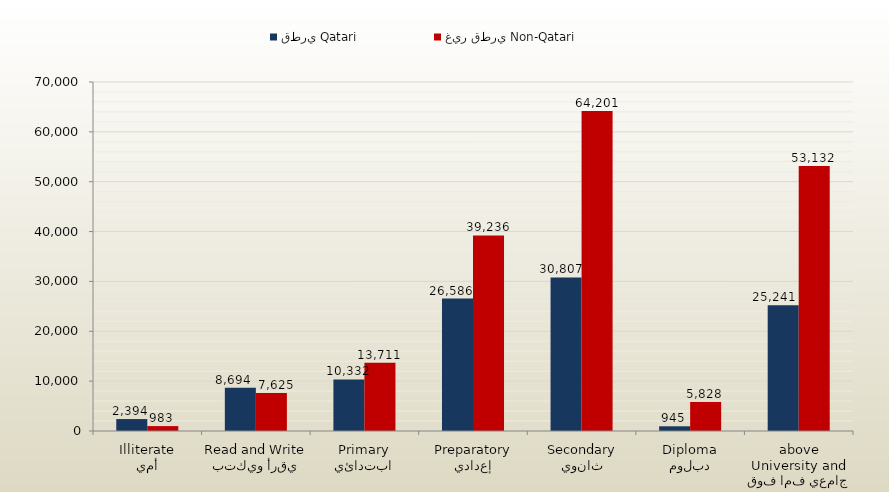
| Category | قطري Qatari | غير قطري Non-Qatari |
|---|---|---|
| أمي
Illiterate | 2394 | 983 |
| يقرأ ويكتب
Read and Write | 8694 | 7625 |
| ابتدائي
Primary | 10332 | 13711 |
| إعدادي
Preparatory | 26586 | 39236 |
| ثانوي
Secondary | 30807 | 64201 |
| دبلوم
Diploma | 945 | 5828 |
| جامعي فما فوق
University and above | 25241 | 53132 |